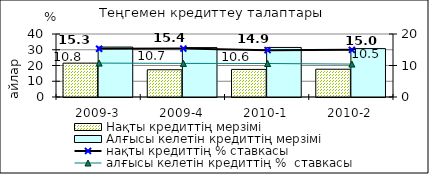
| Category | Нақты кредиттің мерзімі  | Алғысы келетін кредиттің мерзімі  |
|---|---|---|
| 2009-3 | 21.5 | 31.7 |
| 2009-4 | 17.31 | 31.36 |
| 2010-1 | 17.51 | 31.46 |
| 2010-2 | 17.63 | 30.73 |